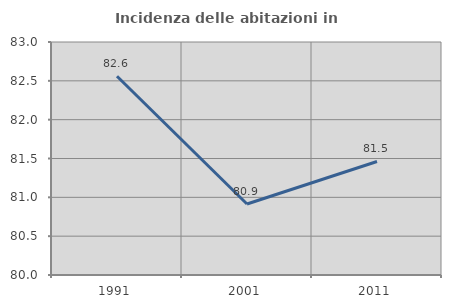
| Category | Incidenza delle abitazioni in proprietà  |
|---|---|
| 1991.0 | 82.559 |
| 2001.0 | 80.914 |
| 2011.0 | 81.461 |